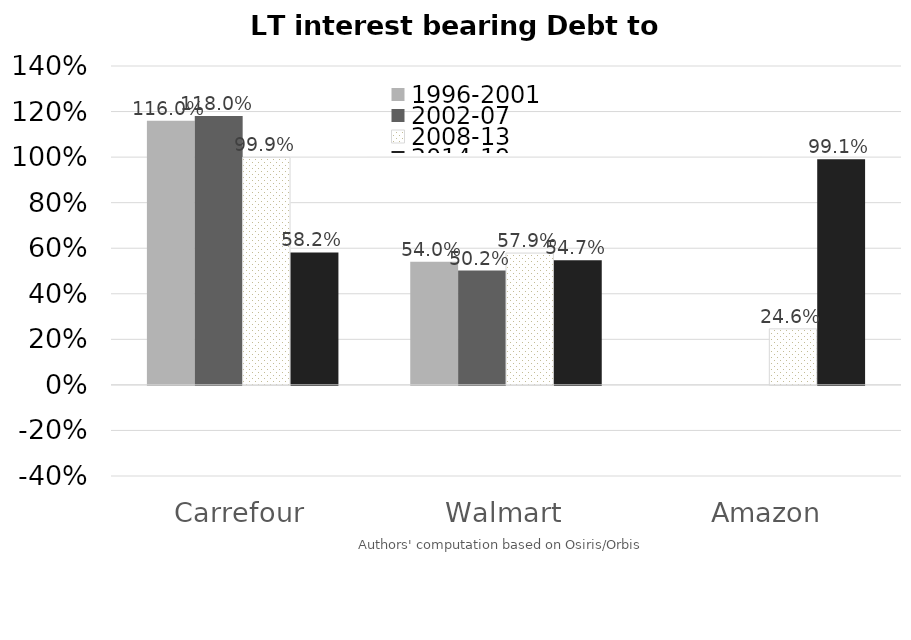
| Category | 1996-2001 | 2002-07 | 2008-13 | 2014-19 |
|---|---|---|---|---|
| Carrefour | 1.16 | 1.18 | 0.999 | 0.582 |
| Walmart | 0.54 | 0.502 | 0.579 | 0.547 |
| Amazon | 1.167 | -0.291 | 0.246 | 0.991 |